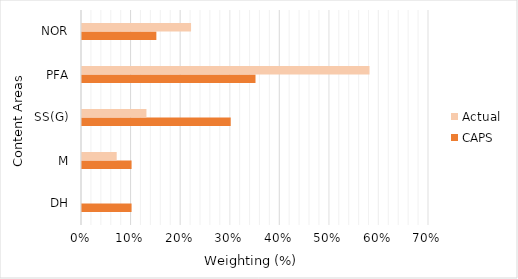
| Category | CAPS | Actual |
|---|---|---|
| DH | 0.1 | 0 |
| M | 0.1 | 0.07 |
| SS(G) | 0.3 | 0.13 |
| PFA | 0.35 | 0.58 |
| NOR | 0.15 | 0.22 |